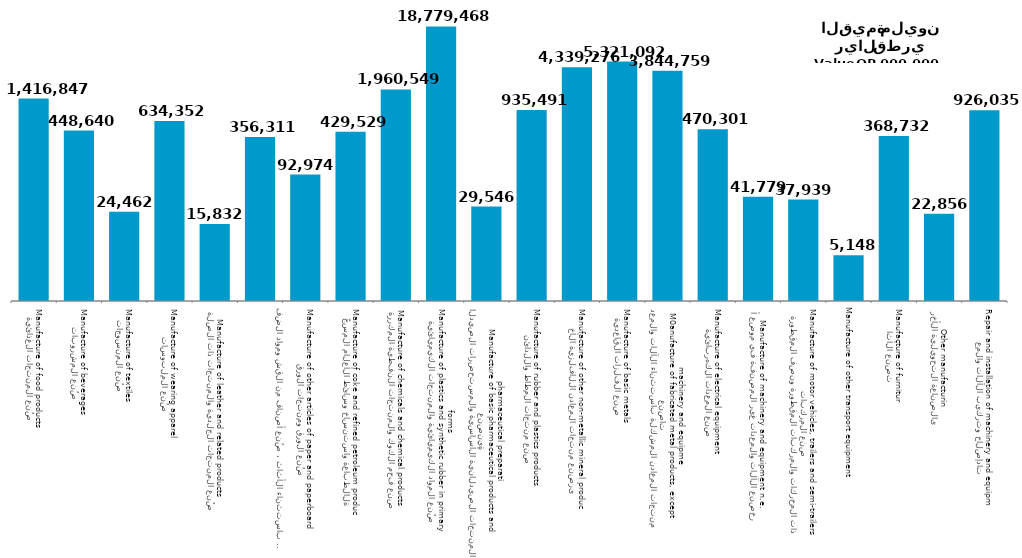
| Category | Series 1 |
|---|---|
| صُنع المنتجات الغذائية
Manufacture of food products | 1416847 |
| صُنع المشروبات
Manufacture of beverages | 448640 |
| صُنع المنسوجات
Manufacture of textiles | 24462 |
| صُنع الملبوسات
Manufacture of wearing apparel | 634352 |
| صُنع المنتجات الجلدية والمنتجات ذات الصلة
Manufacture of leather and related products | 15832 |
| صُنع الخشب ومنتجات الخشب والفلين ، باستثناء الأثاث ، صُنع أصناف من القش ومواد الضفر
Manufacture of wood and of products of wood and cork, except furniture, manufacture of aeticles of straw and plaiting materials plaiting materials | 356311 |
| صُنع الورق ومنتجات الورق
Manufacture of other articles of paper and paperboard | 92974 |
| الطباعة واستنساخ وسائط الأعلام المسجّلة
Manufacture of coke and refined petroleum products | 429529 |
| صنع فحم الكوك والمنتجات النفطية المكررة
Manufacture of chemicals and chemical products | 1960549 |
| صُنع المواد الكيميائية والمنتجات الكيميائية
Manufacture of plastics and synthetic rubber in primary forms | 18779468 |
| صنع المنتجات الصيدلانية الأساسية والمستحضرات الصيدلانية
Manufacture of basic pharmaceutical products and pharmaceutical preparations | 29546 |
| صنع منتجات المطاط واللدائن
Manufacture of rubber and plastics products | 935491 |
| صنع منتجات المعادن اللافلزية الأخرى
Manufacture of other non-metallic mineral products | 4339276 |
| صنع الفلزات القاعدية
Manufacture of basic metals | 5321092 |
| صنع منتجات المعادن المشكلة باستثناء الآلات والمعدات
M0anufacture of fabricated metal products, except machinery and equipment | 3844759 |
| صنع المعدات الكهربائية
Manufacture of electrical equipment | 470301 |
| صنع الآلات والمعدات غير المصنفة في موضع أخر
Manufacture of machinery and equipment n.e.c. | 41779 |
| صنع المركبات ذات المحركات والمركبات المقطورة ونصف المقطورة
Manufacture of motor vehicles, trailers and semi-trailers | 37939 |
| Manufacture of other transport equipment | 5148 |
| صنع الأثاث
Manufacture of furniture | 368732 |
| الصناعة التحويلية الأخرى
Other manufacturing | 22856 |
| إصلاح وتركيب الآلات والمعدات
Repair and installation of machinery and equipment | 926035 |